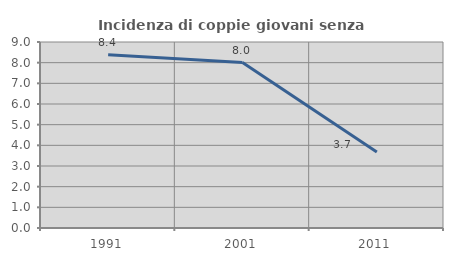
| Category | Incidenza di coppie giovani senza figli |
|---|---|
| 1991.0 | 8.386 |
| 2001.0 | 8.007 |
| 2011.0 | 3.678 |